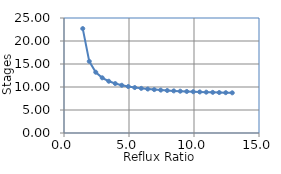
| Category | Series 0 |
|---|---|
| 1.4426861453323419 | 22.7 |
| 1.9426861453323419 | 15.579 |
| 2.442686145332342 | 13.211 |
| 2.942686145332342 | 11.998 |
| 3.442686145332342 | 11.253 |
| 3.942686145332342 | 10.747 |
| 4.442686145332342 | 10.38 |
| 4.942686145332342 | 10.1 |
| 5.442686145332342 | 9.88 |
| 5.942686145332342 | 9.702 |
| 6.442686145332342 | 9.555 |
| 6.942686145332342 | 9.432 |
| 7.442686145332342 | 9.327 |
| 7.942686145332342 | 9.236 |
| 8.442686145332342 | 9.157 |
| 8.942686145332342 | 9.088 |
| 9.442686145332342 | 9.026 |
| 9.942686145332342 | 8.971 |
| 10.442686145332342 | 8.922 |
| 10.942686145332342 | 8.877 |
| 11.442686145332342 | 8.837 |
| 11.942686145332342 | 8.8 |
| 12.442686145332342 | 8.766 |
| 12.942686145332342 | 8.735 |